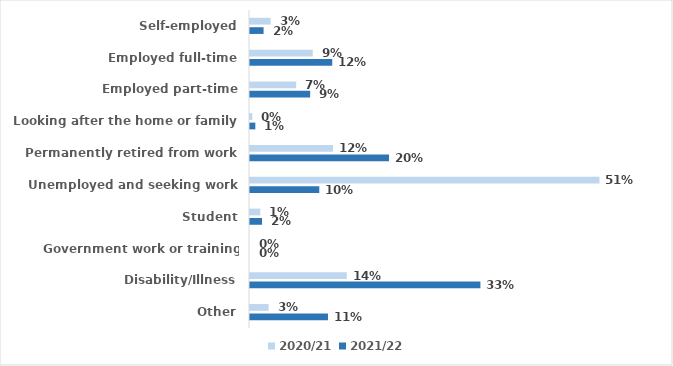
| Category | 2020/21 | 2021/22 |
|---|---|---|
| Self-employed | 0.03 | 0.02 |
| Employed full-time | 0.091 | 0.119 |
| Employed part-time | 0.067 | 0.087 |
| Looking after the home or family | 0.003 | 0.008 |
| Permanently retired from work | 0.12 | 0.201 |
| Unemployed and seeking work | 0.506 | 0.1 |
| Student | 0.015 | 0.017 |
| Government work or training scheme | 0 | 0 |
| Disability/Illness | 0.14 | 0.334 |
| Other | 0.027 | 0.113 |